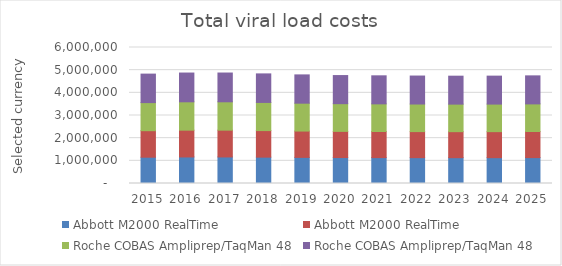
| Category | Abbott M2000 RealTime | Roche COBAS Ampliprep/TaqMan 48 |
|---|---|---|
| 2015.0 | 1170052.713 | 1257090.796 |
| 2016.0 | 1181510.154 | 1269400.535 |
| 2017.0 | 1181674.119 | 1269576.697 |
| 2018.0 | 1172247.356 | 1259448.695 |
| 2019.0 | 1161479.342 | 1247879.668 |
| 2020.0 | 1154286.12 | 1240151.354 |
| 2021.0 | 1151443.356 | 1237097.123 |
| 2022.0 | 1149087.247 | 1234565.747 |
| 2023.0 | 1147600.381 | 1232968.276 |
| 2024.0 | 1148047.489 | 1233448.643 |
| 2025.0 | 1150905.644 | 1236519.411 |